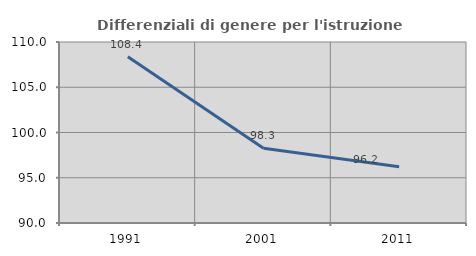
| Category | Differenziali di genere per l'istruzione superiore |
|---|---|
| 1991.0 | 108.378 |
| 2001.0 | 98.27 |
| 2011.0 | 96.224 |